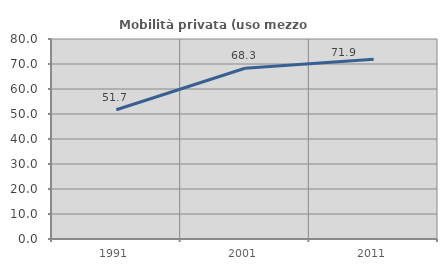
| Category | Mobilità privata (uso mezzo privato) |
|---|---|
| 1991.0 | 51.706 |
| 2001.0 | 68.285 |
| 2011.0 | 71.906 |